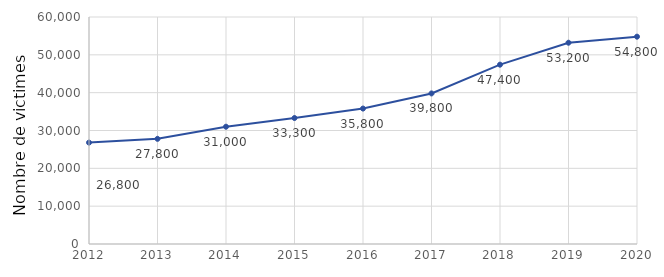
| Category | Series 0 |
|---|---|
| 2012.0 | 26800 |
| 2013.0 | 27800 |
| 2014.0 | 31000 |
| 2015.0 | 33300 |
| 2016.0 | 35800 |
| 2017.0 | 39800 |
| 2018.0 | 47400 |
| 2019.0 | 53200 |
| 2020.0 | 54800 |